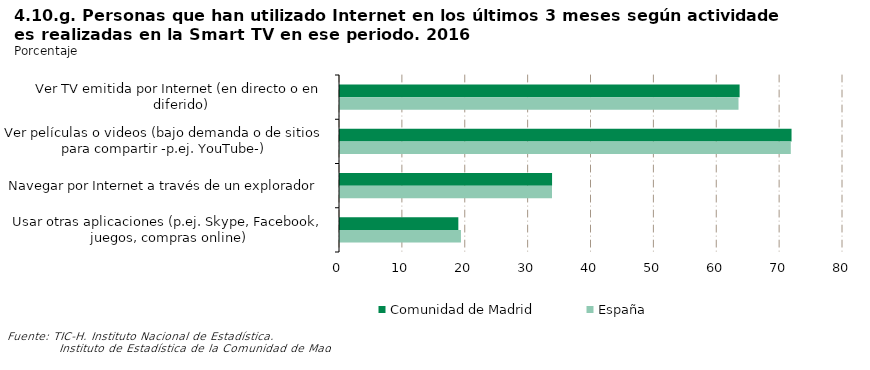
| Category | Comunidad de Madrid | España |
|---|---|---|
| Ver TV emitida por Internet (en directo o en diferido) | 63.555 | 63.381 |
| Ver películas o videos (bajo demanda o de sitios para compartir -p.ej. YouTube-) | 71.815 | 71.697 |
| Navegar por Internet a través de un explorador | 33.728 | 33.716 |
| Usar otras aplicaciones (p.ej. Skype, Facebook, juegos, compras online) | 18.821 | 19.235 |